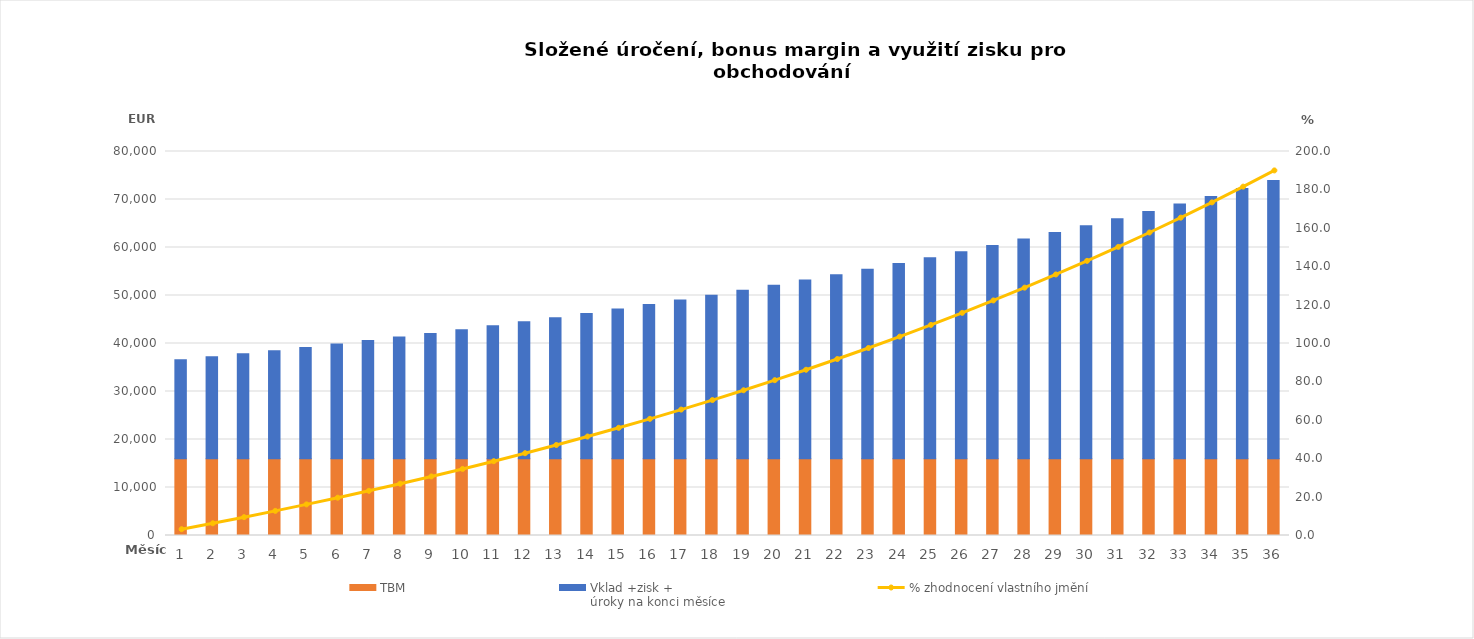
| Category | TBM | Vklad +zisk +
úroky na konci měsíce |
|---|---|---|
| 1.0 | 16000 | 20604 |
| 2.0 | 16000 | 21222.12 |
| 3.0 | 16000 | 21858.784 |
| 4.0 | 16000 | 22514.547 |
| 5.0 | 16000 | 23189.984 |
| 6.0 | 16000 | 23885.683 |
| 7.0 | 16000 | 24602.254 |
| 8.0 | 16000 | 25340.321 |
| 9.0 | 16000 | 26100.531 |
| 10.0 | 16000 | 26883.547 |
| 11.0 | 16000 | 27690.053 |
| 12.0 | 16000 | 28520.755 |
| 13.0 | 16000 | 29376.377 |
| 14.0 | 16000 | 30257.669 |
| 15.0 | 16000 | 31165.399 |
| 16.0 | 16000 | 32100.361 |
| 17.0 | 16000 | 33063.371 |
| 18.0 | 16000 | 34055.273 |
| 19.0 | 16000 | 35076.931 |
| 20.0 | 16000 | 36129.239 |
| 21.0 | 16000 | 37213.116 |
| 22.0 | 16000 | 38329.509 |
| 23.0 | 16000 | 39479.395 |
| 24.0 | 16000 | 40663.776 |
| 25.0 | 16000 | 41883.69 |
| 26.0 | 16000 | 43140.2 |
| 27.0 | 16000 | 44434.406 |
| 28.0 | 16000 | 45767.439 |
| 29.0 | 16000 | 47140.462 |
| 30.0 | 16000 | 48554.676 |
| 31.0 | 16000 | 50011.316 |
| 32.0 | 16000 | 51511.655 |
| 33.0 | 16000 | 53057.005 |
| 34.0 | 16000 | 54648.715 |
| 35.0 | 16000 | 56288.177 |
| 36.0 | 16000 | 57976.822 |